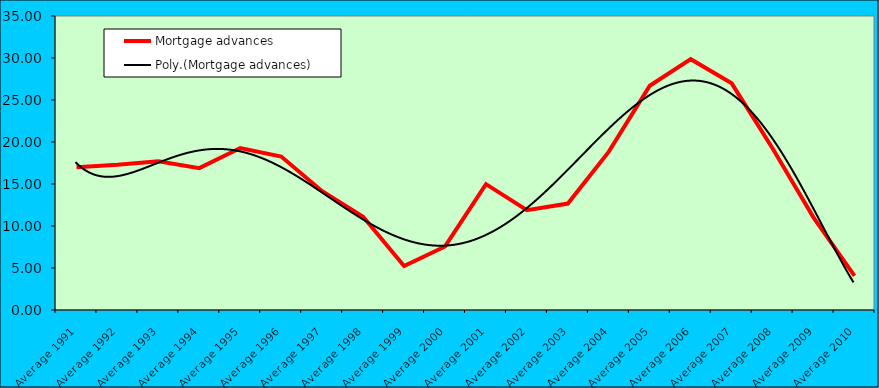
| Category | Mortgage advances |
|---|---|
| Average 1991 | 17.008 |
| Average 1992 | 17.288 |
| Average 1993 | 17.715 |
| Average 1994 | 16.887 |
| Average 1995 | 19.283 |
| Average 1996 | 18.264 |
| Average 1997 | 14.145 |
| Average 1998 | 11.109 |
| Average 1999 | 5.238 |
| Average 2000 | 7.564 |
| Average 2001 | 14.984 |
| Average 2002 | 11.888 |
| Average 2003 | 12.668 |
| Average 2004 | 18.854 |
| Average 2005 | 26.699 |
| Average 2006 | 29.863 |
| Average 2007 | 26.982 |
| Average 2008 | 19.234 |
| Average 2009 | 10.996 |
| Average 2010 | 4.056 |